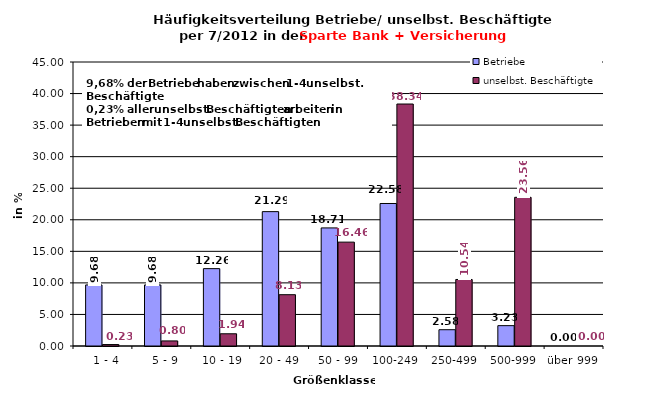
| Category | Betriebe | unselbst. Beschäftigte |
|---|---|---|
|   1 - 4 | 9.677 | 0.23 |
|   5 - 9 | 9.677 | 0.804 |
|  10 - 19 | 12.258 | 1.937 |
| 20 - 49 | 21.29 | 8.129 |
| 50 - 99 | 18.71 | 16.459 |
| 100-249 | 22.581 | 38.341 |
| 250-499 | 2.581 | 10.54 |
| 500-999 | 3.226 | 23.561 |
| über 999 | 0 | 0 |